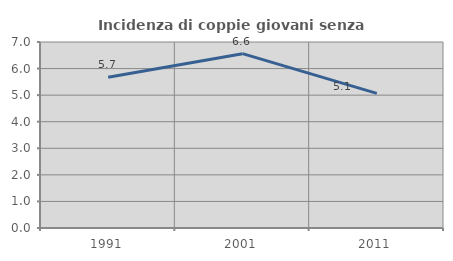
| Category | Incidenza di coppie giovani senza figli |
|---|---|
| 1991.0 | 5.673 |
| 2001.0 | 6.56 |
| 2011.0 | 5.067 |